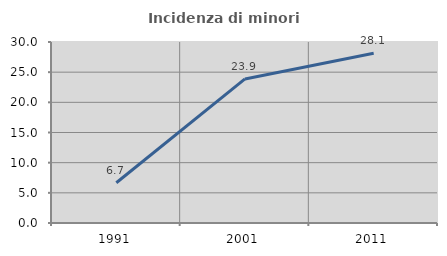
| Category | Incidenza di minori stranieri |
|---|---|
| 1991.0 | 6.667 |
| 2001.0 | 23.881 |
| 2011.0 | 28.125 |